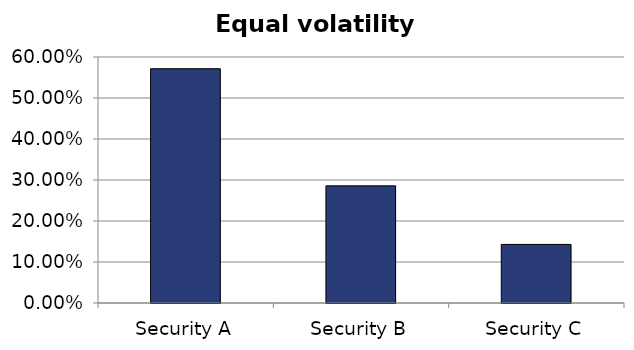
| Category | Weight |
|---|---|
| Security A | 0.571 |
| Security B | 0.286 |
| Security C | 0.143 |